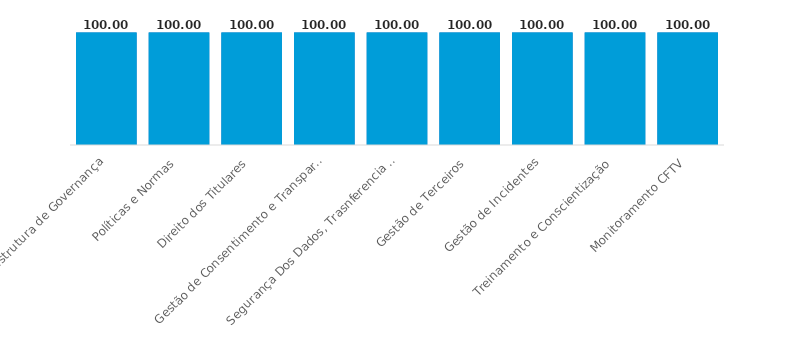
| Category | FEITO | Ruim | Médio | Ótimo |
|---|---|---|---|---|
| Estrutura de Governança | 1 | 0 | 0 | 1 |
| Políticas e Normas | 1 | 0 | 0 | 1 |
| Direito dos Titulares | 1 | 0 | 0 | 1 |
| Gestão de Consentimento e Transparência | 1 | 0 | 0 | 1 |
| Segurança Dos Dados, Trasnferencia Internacional e Violações | 1 | 0 | 0 | 1 |
| Gestão de Terceiros | 1 | 0 | 0 | 1 |
| Gestão de Incidentes | 1 | 0 | 0 | 1 |
| Treinamento e Conscientização | 1 | 0 | 0 | 1 |
| Monitoramento CFTV | 1 | 0 | 0 | 1 |